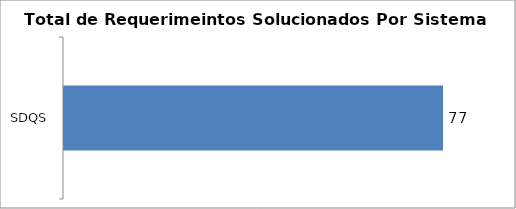
| Category | Total |
|---|---|
| SDQS | 77 |